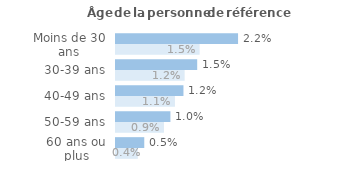
| Category | Series 1 | Series 0 |
|---|---|---|
| Moins de 30 ans | 0.022 | 0.015 |
| 30-39 ans | 0.015 | 0.012 |
| 40-49 ans | 0.012 | 0.011 |
| 50-59 ans | 0.01 | 0.009 |
| 60 ans ou plus | 0.005 | 0.004 |